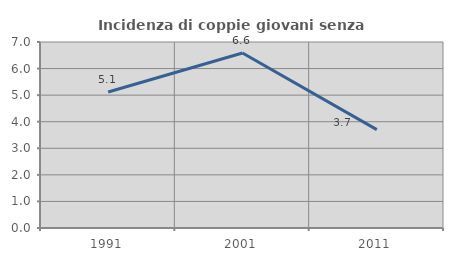
| Category | Incidenza di coppie giovani senza figli |
|---|---|
| 1991.0 | 5.12 |
| 2001.0 | 6.584 |
| 2011.0 | 3.704 |